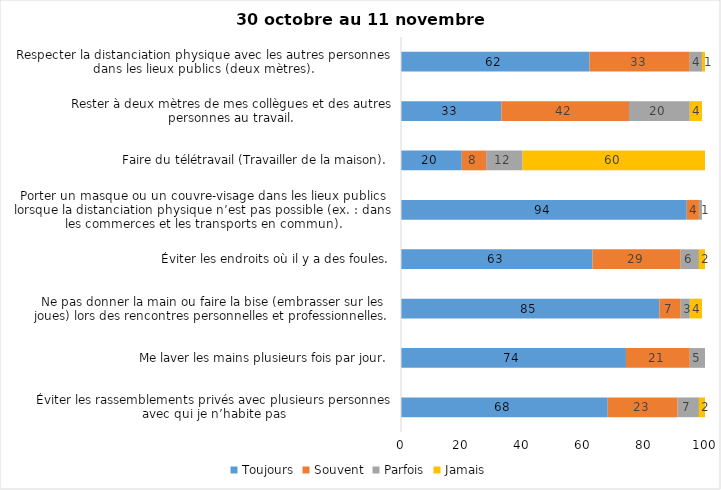
| Category | Toujours | Souvent | Parfois | Jamais |
|---|---|---|---|---|
| Éviter les rassemblements privés avec plusieurs personnes avec qui je n’habite pas | 68 | 23 | 7 | 2 |
| Me laver les mains plusieurs fois par jour. | 74 | 21 | 5 | 0 |
| Ne pas donner la main ou faire la bise (embrasser sur les joues) lors des rencontres personnelles et professionnelles. | 85 | 7 | 3 | 4 |
| Éviter les endroits où il y a des foules. | 63 | 29 | 6 | 2 |
| Porter un masque ou un couvre-visage dans les lieux publics lorsque la distanciation physique n’est pas possible (ex. : dans les commerces et les transports en commun). | 94 | 4 | 1 | 0 |
| Faire du télétravail (Travailler de la maison). | 20 | 8 | 12 | 60 |
| Rester à deux mètres de mes collègues et des autres personnes au travail. | 33 | 42 | 20 | 4 |
| Respecter la distanciation physique avec les autres personnes dans les lieux publics (deux mètres). | 62 | 33 | 4 | 1 |